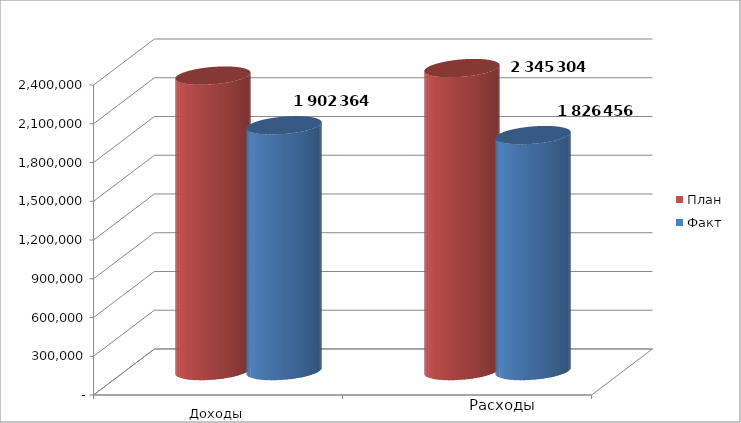
| Category | План | Факт |
|---|---|---|
| 0 | 2286989 | 1902364 |
| 1 | 2345304 | 1826455.7 |